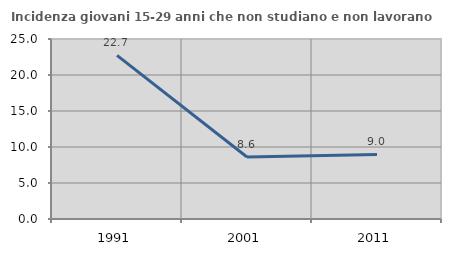
| Category | Incidenza giovani 15-29 anni che non studiano e non lavorano  |
|---|---|
| 1991.0 | 22.733 |
| 2001.0 | 8.612 |
| 2011.0 | 8.962 |